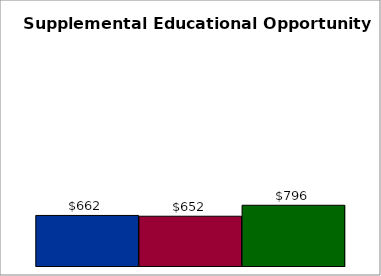
| Category | 50 states and D.C. | SREB states | State |
|---|---|---|---|
| 0 | 662.248 | 652.092 | 795.648 |